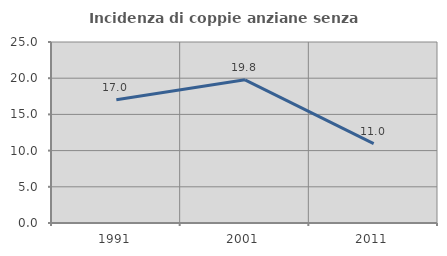
| Category | Incidenza di coppie anziane senza figli  |
|---|---|
| 1991.0 | 17.021 |
| 2001.0 | 19.78 |
| 2011.0 | 10.976 |